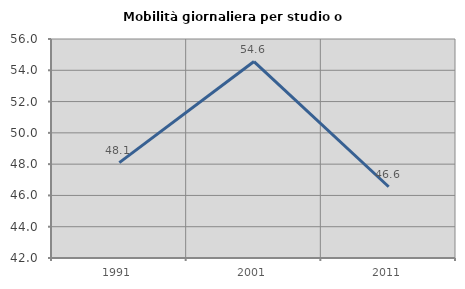
| Category | Mobilità giornaliera per studio o lavoro |
|---|---|
| 1991.0 | 48.1 |
| 2001.0 | 54.559 |
| 2011.0 | 46.555 |